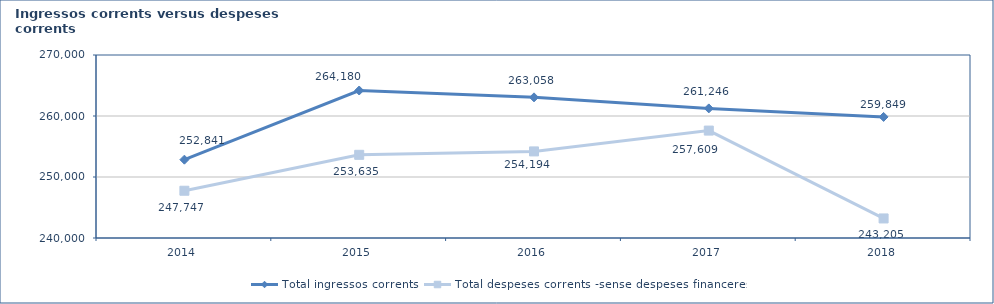
| Category | Total ingressos corrents  | Total despeses corrents -sense despeses financeres- |
|---|---|---|
| 2014.0 | 252841.078 | 247746.75 |
| 2015.0 | 264180.224 | 253634.968 |
| 2016.0 | 263057.604 | 254193.809 |
| 2017.0 | 261245.759 | 257608.831 |
| 2018.0 | 259849.34 | 243204.742 |